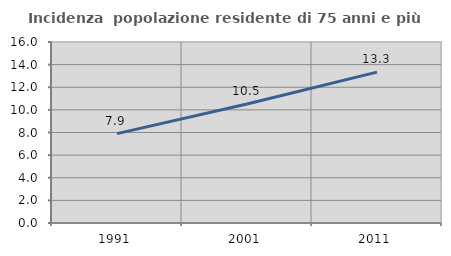
| Category | Incidenza  popolazione residente di 75 anni e più |
|---|---|
| 1991.0 | 7.899 |
| 2001.0 | 10.519 |
| 2011.0 | 13.333 |